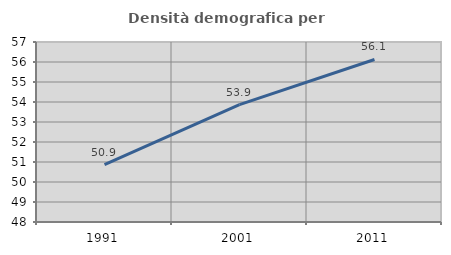
| Category | Densità demografica |
|---|---|
| 1991.0 | 50.864 |
| 2001.0 | 53.871 |
| 2011.0 | 56.126 |